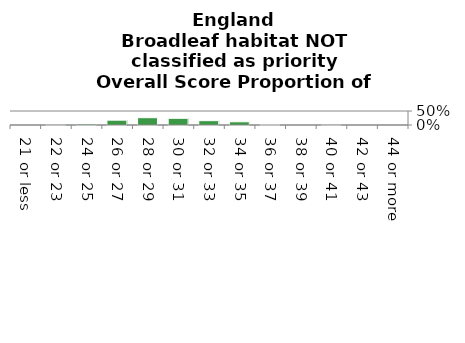
| Category | Broadleaf habitat NOT classified as priority |
|---|---|
| 21 or less | 0 |
| 22 or 23 | 0.003 |
| 24 or 25 | 0.036 |
| 26 or 27 | 0.172 |
| 28 or 29 | 0.26 |
| 30 or 31 | 0.239 |
| 32 or 33 | 0.155 |
| 34 or 35 | 0.115 |
| 36 or 37 | 0.019 |
| 38 or 39 | 0 |
| 40 or 41 | 0.001 |
| 42 or 43 | 0 |
| 44 or more | 0 |